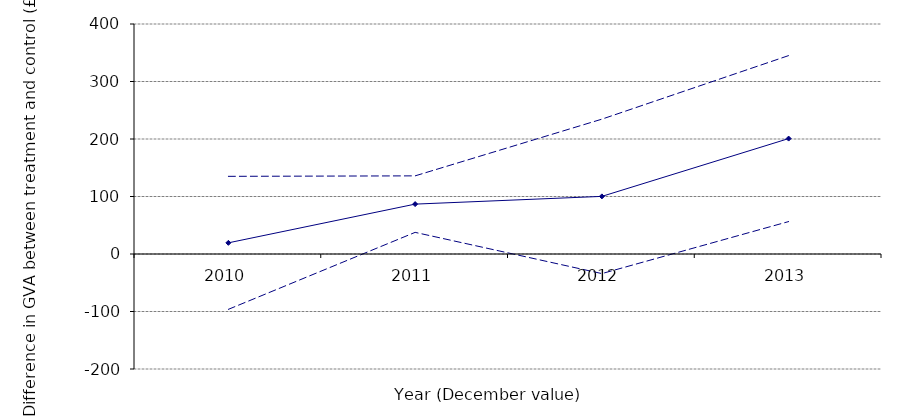
| Category | Mean diff | 5% | 95% |
|---|---|---|---|
| 2010.0 | 19.407 | -96.258 | 135.072 |
| 2011.0 | 86.755 | 37.62 | 135.891 |
| 2012.0 | 100.215 | -34.07 | 234.501 |
| 2013.0 | 200.724 | 56.391 | 345.058 |